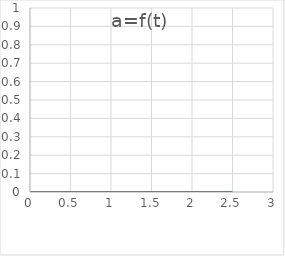
| Category | a=f(t) |
|---|---|
| 0.0 | 0 |
| 0.125 | 0 |
| 0.25 | 0 |
| 0.375 | 0 |
| 0.5 | 0 |
| 0.625 | 0 |
| 0.75 | 0 |
| 0.875 | 0 |
| 1.0 | 0 |
| 1.125 | 0 |
| 1.25 | 0 |
| 1.375 | 0 |
| 1.5 | 0 |
| 1.625 | 0 |
| 1.75 | 0 |
| 1.875 | 0 |
| 2.0 | 0 |
| 2.125 | 0 |
| 2.25 | 0 |
| 2.375 | 0 |
| 2.5 | 0 |